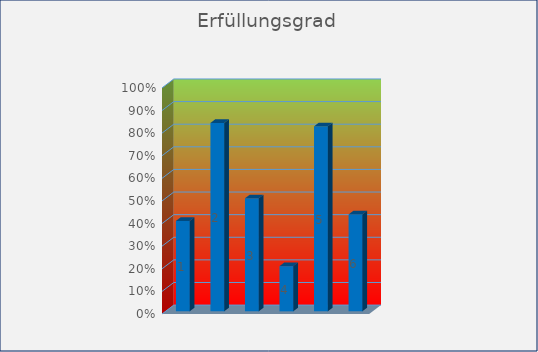
| Category | Erfüllungsgrad |
|---|---|
| Relevanz personenbezogene Daten | 0.4 |
| Verfahrensübersicht Datenschutz | 0.833 |
| Formale Vorgaben zum Datenschutz | 0.5 |
| Datensicherheit | 0.2 |
| IT-Sicherheit | 0.818 |
| DSGVO Vorbereitung | 0.429 |